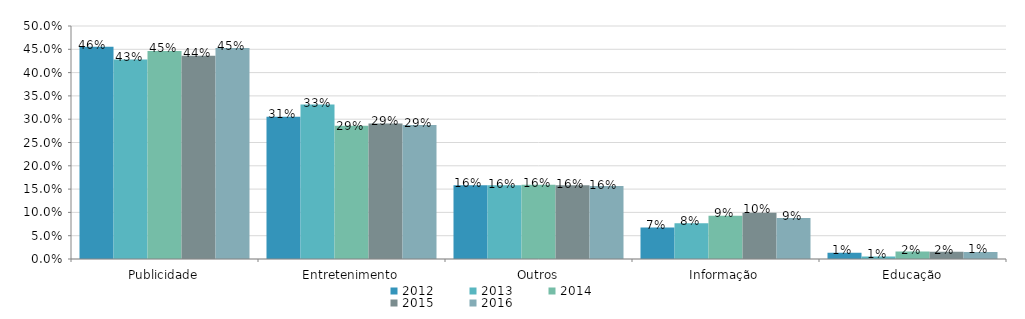
| Category | 2012 | 2013 | 2014 | 2015 | 2016 |
|---|---|---|---|---|---|
| Publicidade | 0.455 | 0.428 | 0.446 | 0.436 | 0.453 |
| Entretenimento | 0.305 | 0.331 | 0.286 | 0.291 | 0.288 |
| Outros | 0.158 | 0.158 | 0.159 | 0.158 | 0.157 |
| Informação | 0.068 | 0.077 | 0.093 | 0.099 | 0.088 |
| Educação | 0.013 | 0.006 | 0.016 | 0.015 | 0.015 |